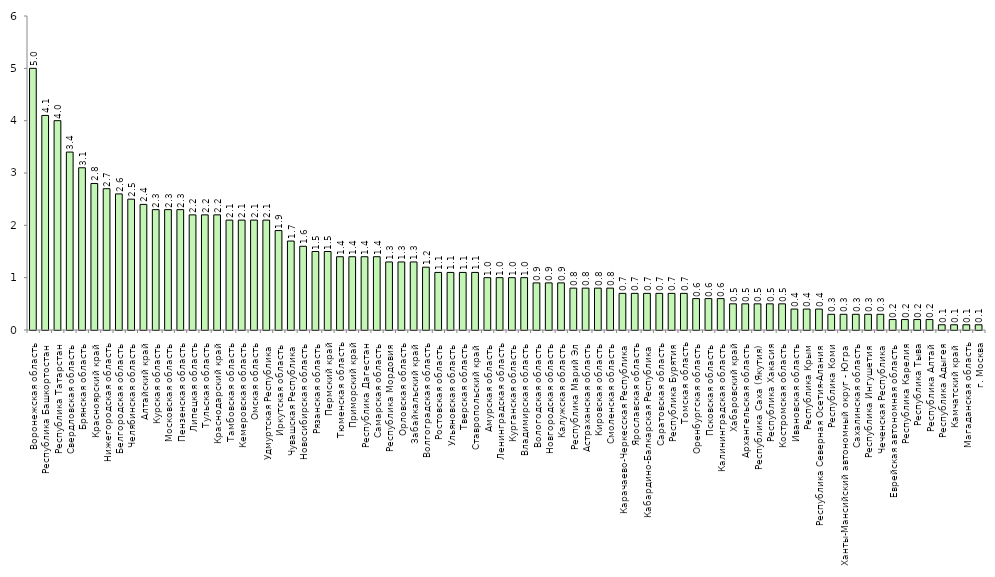
| Category | Series 0 |
|---|---|
| Воронежская область | 5 |
| Республика Башкортостан | 4.1 |
| Республика Татарстан | 4 |
| Свердловская область | 3.4 |
| Брянская область | 3.1 |
| Красноярский край | 2.8 |
| Нижегородская область | 2.7 |
| Белгородская область | 2.6 |
| Челябинская область | 2.5 |
| Алтайский край | 2.4 |
| Курская область | 2.3 |
| Московская область | 2.3 |
| Пензенская область | 2.3 |
| Липецкая область | 2.2 |
| Тульская область | 2.2 |
| Краснодарский край | 2.2 |
| Тамбовская область | 2.1 |
| Кемеровская область | 2.1 |
| Омская область | 2.1 |
| Удмуртская Республика | 2.1 |
| Иркутская область | 1.9 |
| Чувашская Республика | 1.7 |
| Новосибирская область | 1.6 |
| Рязанская область | 1.5 |
| Пермский край | 1.5 |
| Тюменская область | 1.4 |
| Приморский край | 1.4 |
| Республика Дагестан | 1.4 |
| Самарская область | 1.4 |
| Республика Мордовия | 1.3 |
| Орловская область | 1.3 |
| Забайкальский край | 1.3 |
| Волгоградская область | 1.2 |
| Ростовская область | 1.1 |
| Ульяновская область | 1.1 |
| Тверская область | 1.1 |
| Ставропольский край | 1.1 |
| Амурская область | 1 |
| Ленинградская область | 1 |
| Курганская область | 1 |
| Владимирская область | 1 |
| Вологодская область | 0.9 |
| Новгородская область | 0.9 |
| Калужская область | 0.9 |
| Республика Марий Эл | 0.8 |
| Астраханская область | 0.8 |
| Кировская область | 0.8 |
| Смоленская область | 0.8 |
| Карачаево-Черкесская Республика | 0.7 |
| Ярославская область | 0.7 |
| Кабардино-Балкарская Республика | 0.7 |
| Саратовская область | 0.7 |
| Республика Бурятия | 0.7 |
| Томская область | 0.7 |
| Оренбургская область | 0.6 |
| Псковская область | 0.6 |
| Калининградская область | 0.6 |
| Хабаровский край | 0.5 |
| Архангельская область | 0.5 |
| Республика Саха (Якутия) | 0.5 |
| Республика Хакасия | 0.5 |
| Костромская область | 0.5 |
| Ивановская область | 0.4 |
| Республика Крым | 0.4 |
| Республика Северная Осетия-Алания | 0.4 |
| Республика Коми | 0.3 |
| Ханты-Мансийский автономный округ - Югра | 0.3 |
| Сахалинская область | 0.3 |
| Республика Ингушетия | 0.3 |
| Чеченская Республика | 0.3 |
| Еврейская автономная область | 0.2 |
| Республика Карелия | 0.2 |
| Республика Тыва | 0.2 |
| Республика Алтай | 0.2 |
| Республика Адыгея | 0.1 |
| Камчатский край | 0.1 |
| Магаданская область | 0.1 |
| г. Москва | 0.1 |